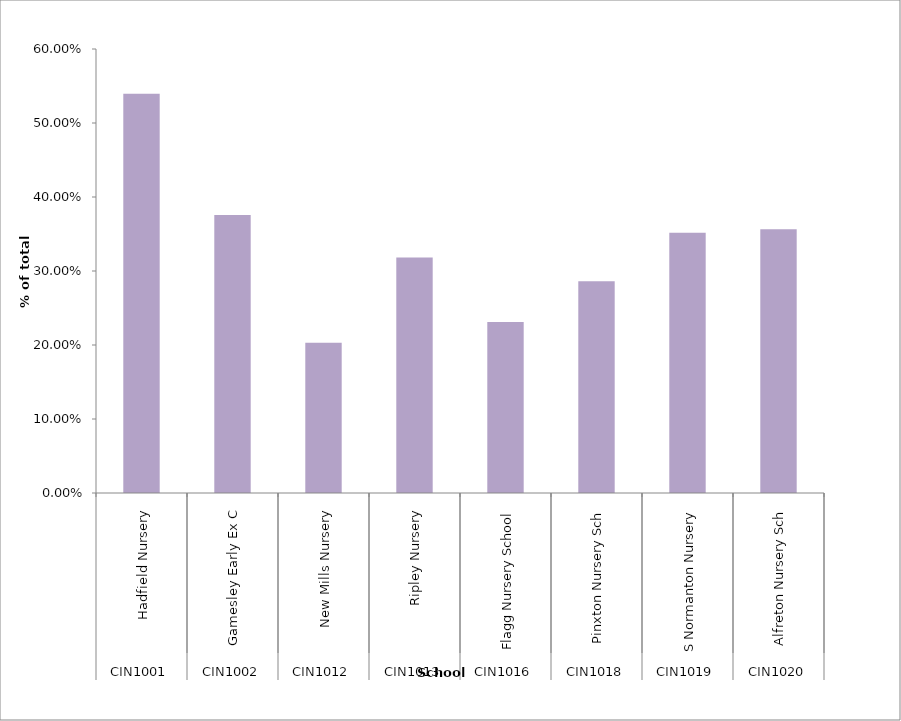
| Category | % |
|---|---|
| 0 | 0.539 |
| 1 | 0.376 |
| 2 | 0.203 |
| 3 | 0.318 |
| 4 | 0.231 |
| 5 | 0.286 |
| 6 | 0.352 |
| 7 | 0.356 |